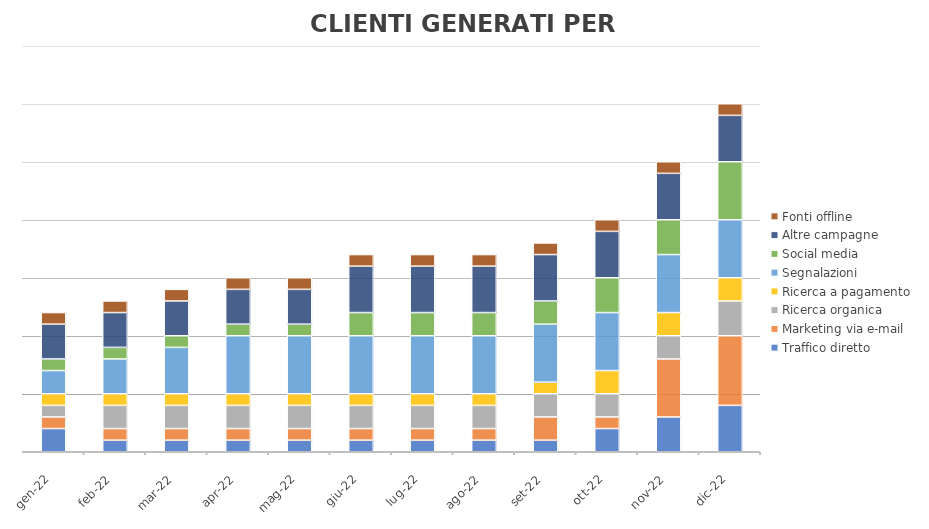
| Category | Traffico diretto | Marketing via e-mail | Ricerca organica | Ricerca a pagamento | Segnalazioni | Social media | Altre campagne | Fonti offline |
|---|---|---|---|---|---|---|---|---|
| 2022-01-18 | 2 | 1 | 1 | 1 | 2 | 1 | 3 | 1 |
| 2022-02-18 | 1 | 1 | 2 | 1 | 3 | 1 | 3 | 1 |
| 2022-03-18 | 1 | 1 | 2 | 1 | 4 | 1 | 3 | 1 |
| 2022-04-18 | 1 | 1 | 2 | 1 | 5 | 1 | 3 | 1 |
| 2022-05-18 | 1 | 1 | 2 | 1 | 5 | 1 | 3 | 1 |
| 2022-06-18 | 1 | 1 | 2 | 1 | 5 | 2 | 4 | 1 |
| 2022-07-18 | 1 | 1 | 2 | 1 | 5 | 2 | 4 | 1 |
| 2022-08-18 | 1 | 1 | 2 | 1 | 5 | 2 | 4 | 1 |
| 2022-09-18 | 1 | 2 | 2 | 1 | 5 | 2 | 4 | 1 |
| 2022-10-18 | 2 | 1 | 2 | 2 | 5 | 3 | 4 | 1 |
| 2022-11-18 | 3 | 5 | 2 | 2 | 5 | 3 | 4 | 1 |
| 2022-12-18 | 4 | 6 | 3 | 2 | 5 | 5 | 4 | 1 |